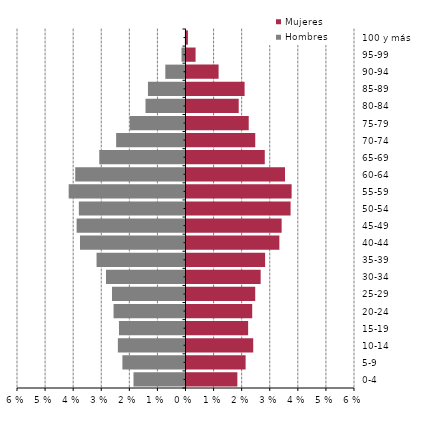
| Category | Hombres | Mujeres |
|---|---|---|
| 0-4 | -0.019 | 0.018 |
| 5-9 | -0.022 | 0.021 |
| 10-14 | -0.024 | 0.024 |
| 15-19 | -0.024 | 0.022 |
| 20-24 | -0.026 | 0.023 |
| 25-29 | -0.026 | 0.024 |
| 30-34 | -0.028 | 0.026 |
| 35-39 | -0.032 | 0.028 |
| 40-44 | -0.038 | 0.033 |
| 45-49 | -0.039 | 0.034 |
| 50-54 | -0.038 | 0.037 |
| 55-59 | -0.042 | 0.037 |
| 60-64 | -0.039 | 0.035 |
| 65-69 | -0.031 | 0.028 |
| 70-74 | -0.025 | 0.024 |
| 75-79 | -0.02 | 0.022 |
| 80-84 | -0.014 | 0.019 |
| 85-89 | -0.013 | 0.021 |
| 90-94 | -0.007 | 0.011 |
| 95-99 | -0.001 | 0.003 |
| 100 y más | 0 | 0 |